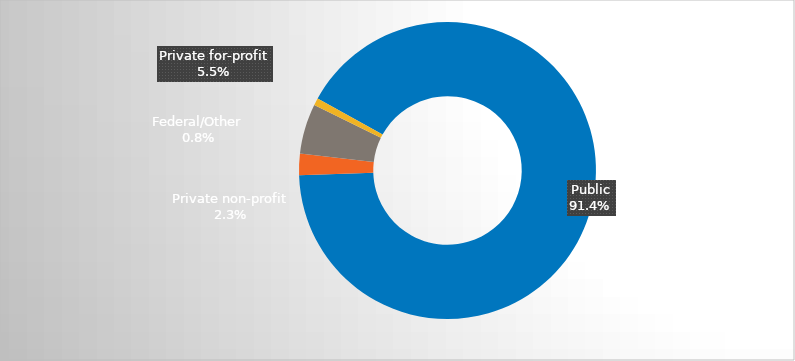
| Category | Series 0 |
|---|---|
| Public | 0.914 |
| Private non-profit | 0.023 |
| Private for-profit | 0.054 |
| Federal/Other | 0.008 |